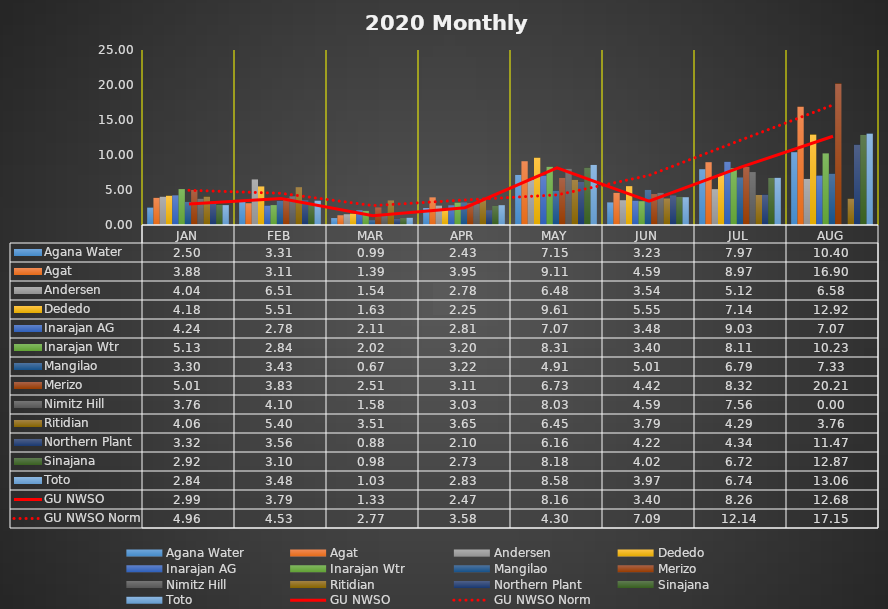
| Category | Agana Water | Agat | Andersen | Dededo | Inarajan AG | Inarajan Wtr | Mangilao | Merizo | Nimitz Hill | Ritidian | Northern Plant | Sinajana | Toto |
|---|---|---|---|---|---|---|---|---|---|---|---|---|---|
| JAN | 2.5 | 3.88 | 4.04 | 4.18 | 4.24 | 5.13 | 3.3 | 5.01 | 3.76 | 4.06 | 3.32 | 2.92 | 2.84 |
| FEB | 3.31 | 3.11 | 6.51 | 5.51 | 2.78 | 2.84 | 3.43 | 3.83 | 4.1 | 5.4 | 3.56 | 3.1 | 3.48 |
| MAR | 0.99 | 1.39 | 1.54 | 1.63 | 2.11 | 2.02 | 0.67 | 2.51 | 1.58 | 3.51 | 0.88 | 0.98 | 1.03 |
| APR | 2.43 | 3.95 | 2.78 | 2.25 | 2.81 | 3.2 | 3.22 | 3.11 | 3.03 | 3.65 | 2.1 | 2.73 | 2.83 |
| MAY | 7.15 | 9.11 | 6.48 | 9.61 | 7.07 | 8.31 | 4.91 | 6.73 | 8.03 | 6.45 | 6.16 | 8.18 | 8.58 |
| JUN | 3.23 | 4.59 | 3.54 | 5.55 | 3.48 | 3.4 | 5.01 | 4.42 | 4.59 | 3.79 | 4.22 | 4.02 | 3.97 |
| JUL | 7.97 | 8.97 | 5.12 | 7.14 | 9.03 | 8.11 | 6.79 | 8.32 | 7.56 | 4.29 | 4.34 | 6.72 | 6.74 |
| AUG | 10.4 | 16.9 | 6.58 | 12.92 | 7.07 | 10.23 | 7.33 | 20.21 | 0 | 3.76 | 11.47 | 12.87 | 13.06 |